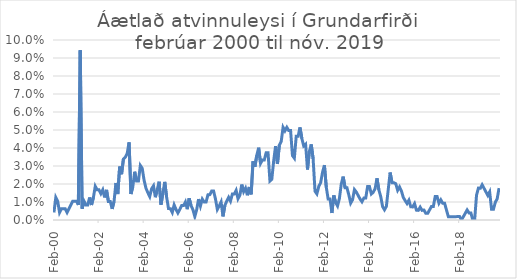
| Category | Series 0 |
|---|---|
| 2000-02-01 | 0.004 |
| 2000-03-01 | 0.013 |
| 2000-04-01 | 0.01 |
| 2000-05-01 | 0.004 |
| 2000-06-01 | 0.006 |
| 2000-07-01 | 0.006 |
| 2000-08-01 | 0.006 |
| 2000-09-01 | 0.004 |
| 2000-10-01 | 0.006 |
| 2000-11-01 | 0.008 |
| 2000-12-01 | 0.01 |
| 2001-01-01 | 0.01 |
| 2001-02-01 | 0.01 |
| 2001-03-01 | 0.008 |
| 2001-04-01 | 0.094 |
| 2001-05-01 | 0.006 |
| 2001-06-01 | 0.01 |
| 2001-07-01 | 0.008 |
| 2001-08-01 | 0.008 |
| 2001-09-01 | 0.012 |
| 2001-10-01 | 0.008 |
| 2001-11-01 | 0.012 |
| 2001-12-01 | 0.019 |
| 2002-01-01 | 0.017 |
| 2002-02-01 | 0.017 |
| 2002-03-01 | 0.015 |
| 2002-04-01 | 0.017 |
| 2002-05-01 | 0.013 |
| 2002-06-01 | 0.017 |
| 2002-07-01 | 0.01 |
| 2002-08-01 | 0.01 |
| 2002-09-01 | 0.006 |
| 2002-10-01 | 0.01 |
| 2002-11-01 | 0.021 |
| 2002-12-01 | 0.014 |
| 2003-01-01 | 0.03 |
| 2003-02-01 | 0.025 |
| 2003-03-01 | 0.034 |
| 2003-04-01 | 0.035 |
| 2003-05-01 | 0.037 |
| 2003-06-01 | 0.043 |
| 2003-07-01 | 0.014 |
| 2003-08-01 | 0.019 |
| 2003-09-01 | 0.027 |
| 2003-10-01 | 0.022 |
| 2003-11-01 | 0.022 |
| 2003-12-01 | 0.03 |
| 2004-01-01 | 0.029 |
| 2004-02-01 | 0.022 |
| 2004-03-01 | 0.018 |
| 2004-04-01 | 0.015 |
| 2004-05-01 | 0.013 |
| 2004-06-01 | 0.017 |
| 2004-07-01 | 0.019 |
| 2004-08-01 | 0.013 |
| 2004-09-01 | 0.017 |
| 2004-10-01 | 0.021 |
| 2004-11-01 | 0.009 |
| 2004-12-01 | 0.015 |
| 2005-01-01 | 0.021 |
| 2005-02-01 | 0.013 |
| 2005-03-01 | 0.006 |
| 2005-04-01 | 0.006 |
| 2005-05-01 | 0.004 |
| 2005-06-01 | 0.008 |
| 2005-07-01 | 0.006 |
| 2005-08-01 | 0.004 |
| 2005-09-01 | 0.006 |
| 2005-10-01 | 0.008 |
| 2005-11-01 | 0.008 |
| 2005-12-01 | 0.01 |
| 2006-01-01 | 0.006 |
| 2006-02-01 | 0.012 |
| 2006-03-01 | 0.008 |
| 2006-04-01 | 0.006 |
| 2006-05-01 | 0.002 |
| 2006-06-01 | 0.006 |
| 2006-07-01 | 0.012 |
| 2006-08-01 | 0.008 |
| 2006-09-01 | 0.012 |
| 2006-10-01 | 0.01 |
| 2006-11-01 | 0.01 |
| 2006-12-01 | 0.014 |
| 2007-01-01 | 0.014 |
| 2007-02-01 | 0.016 |
| 2007-03-01 | 0.016 |
| 2007-04-01 | 0.012 |
| 2007-05-01 | 0.006 |
| 2007-06-01 | 0.008 |
| 2007-07-01 | 0.01 |
| 2007-08-01 | 0.002 |
| 2007-09-01 | 0.008 |
| 2007-10-01 | 0.01 |
| 2007-11-01 | 0.013 |
| 2007-12-01 | 0.01 |
| 2008-01-01 | 0.014 |
| 2008-02-01 | 0.014 |
| 2008-03-01 | 0.016 |
| 2008-04-01 | 0.012 |
| 2008-05-01 | 0.014 |
| 2008-06-01 | 0.02 |
| 2008-07-01 | 0.016 |
| 2008-08-01 | 0.018 |
| 2008-09-01 | 0.014 |
| 2008-10-01 | 0.018 |
| 2008-11-01 | 0.014 |
| 2008-12-01 | 0.033 |
| 2009-01-01 | 0.03 |
| 2009-02-01 | 0.036 |
| 2009-03-01 | 0.04 |
| 2009-04-01 | 0.031 |
| 2009-05-01 | 0.033 |
| 2009-06-01 | 0.033 |
| 2009-07-01 | 0.037 |
| 2009-08-01 | 0.037 |
| 2009-09-01 | 0.022 |
| 2009-10-01 | 0.023 |
| 2009-11-01 | 0.033 |
| 2009-12-01 | 0.041 |
| 2010-01-01 | 0.031 |
| 2010-02-01 | 0.041 |
| 2010-03-01 | 0.044 |
| 2010-04-01 | 0.051 |
| 2010-05-01 | 0.05 |
| 2010-06-01 | 0.051 |
| 2010-07-01 | 0.05 |
| 2010-08-01 | 0.05 |
| 2010-09-01 | 0.036 |
| 2010-10-01 | 0.034 |
| 2010-11-01 | 0.046 |
| 2010-12-01 | 0.046 |
| 2011-01-01 | 0.051 |
| 2011-02-01 | 0.045 |
| 2011-03-01 | 0.041 |
| 2011-04-01 | 0.042 |
| 2011-05-01 | 0.028 |
| 2011-06-01 | 0.038 |
| 2011-07-01 | 0.042 |
| 2011-08-01 | 0.034 |
| 2011-09-01 | 0.016 |
| 2011-10-01 | 0.014 |
| 2011-11-01 | 0.019 |
| 2011-12-01 | 0.021 |
| 2012-01-01 | 0.026 |
| 2012-02-01 | 0.03 |
| 2012-03-01 | 0.018 |
| 2012-04-01 | 0.012 |
| 2012-05-01 | 0.012 |
| 2012-06-01 | 0.004 |
| 2012-07-01 | 0.014 |
| 2012-08-01 | 0.01 |
| 2012-09-01 | 0.008 |
| 2012-10-01 | 0.012 |
| 2012-11-01 | 0.02 |
| 2012-12-01 | 0.024 |
| 2013-01-01 | 0.018 |
| 2013-02-01 | 0.018 |
| 2013-03-01 | 0.014 |
| 2013-04-01 | 0.009 |
| 2013-05-01 | 0.011 |
| 2013-06-01 | 0.017 |
| 2013-07-01 | 0.016 |
| 2013-08-01 | 0.014 |
| 2013-09-01 | 0.012 |
| 2013-10-01 | 0.01 |
| 2013-11-01 | 0.012 |
| 2013-12-01 | 0.012 |
| 2014-01-01 | 0.019 |
| 2014-02-01 | 0.019 |
| 2014-03-01 | 0.014 |
| 2014-04-01 | 0.015 |
| 2014-05-01 | 0.017 |
| 2014-06-01 | 0.023 |
| 2014-07-01 | 0.017 |
| 2014-08-01 | 0.013 |
| 2014-09-01 | 0.007 |
| 2014-10-01 | 0.006 |
| 2014-11-01 | 0.008 |
| 2014-12-01 | 0.017 |
| 2015-01-01 | 0.026 |
| 2015-02-01 | 0.021 |
| 2015-03-01 | 0.021 |
| 2015-04-01 | 0.02 |
| 2015-05-01 | 0.017 |
| 2015-06-01 | 0.018 |
| 2015-07-01 | 0.016 |
| 2015-08-01 | 0.013 |
| 2015-09-01 | 0.011 |
| 2015-10-01 | 0.009 |
| 2015-11-01 | 0.011 |
| 2015-12-01 | 0.007 |
| 2016-01-01 | 0.007 |
| 2016-02-01 | 0.009 |
| 2016-03-01 | 0.005 |
| 2016-04-01 | 0.005 |
| 2016-05-01 | 0.007 |
| 2016-06-01 | 0.005 |
| 2016-07-01 | 0.006 |
| 2016-08-01 | 0.004 |
| 2016-09-01 | 0.004 |
| 2016-10-01 | 0.006 |
| 2016-11-01 | 0.007 |
| 2016-12-01 | 0.007 |
| 2017-01-01 | 0.013 |
| 2017-02-01 | 0.013 |
| 2017-03-01 | 0.009 |
| 2017-04-01 | 0.011 |
| 2017-05-01 | 0.009 |
| 2017-06-01 | 0.009 |
| 2017-07-01 | 0.006 |
| 2017-08-01 | 0.002 |
| 2017-09-01 | 0.002 |
| 2017-10-01 | 0.002 |
| 2017-11-01 | 0.002 |
| 2017-12-01 | 0.002 |
| 2018-01-01 | 0.002 |
| 2018-02-01 | 0.002 |
| 2018-03-01 | 0 |
| 2018-04-01 | 0.002 |
| 2018-05-01 | 0.004 |
| 2018-06-01 | 0.006 |
| 2018-07-01 | 0.004 |
| 2018-08-01 | 0.004 |
| 2018-09-01 | 0 |
| 2018-10-01 | 0 |
| 2018-11-01 | 0.014 |
| 2018-12-01 | 0.018 |
| 2019-01-01 | 0.018 |
| 2019-02-01 | 0.02 |
| 2019-03-01 | 0.018 |
| 2019-04-01 | 0.016 |
| 2019-05-01 | 0.014 |
| 2019-06-01 | 0.016 |
| 2019-07-01 | 0.006 |
| 2019-08-01 | 0.006 |
| 2019-09-01 | 0.01 |
| 2019-10-01 | 0.012 |
| 2019-11-01 | 0.018 |